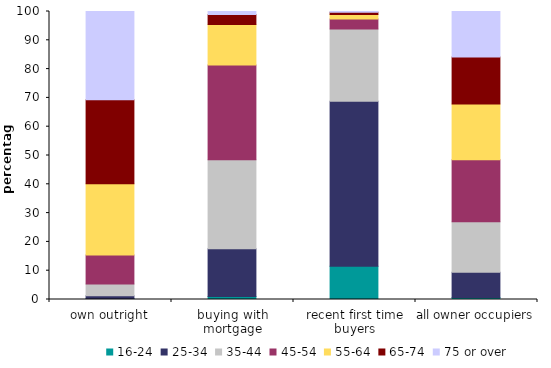
| Category | 16-24 | 25-34 | 35-44 | 45-54 | 55-64 | 65-74 | 75 or over |
|---|---|---|---|---|---|---|---|
| own outright | 0.332 | 0.953 | 4.088 | 10.115 | 24.725 | 29.175 | 30.612 |
| buying with mortgage | 1.008 | 16.645 | 30.868 | 32.861 | 14.085 | 3.466 | 1.068 |
| recent first time buyers | 11.518 | 57.295 | 25.079 | 3.503 | 1.536 | 0.768 | 0.301 |
| all owner occupiers | 0.671 | 8.817 | 17.508 | 21.513 | 19.393 | 16.292 | 15.807 |